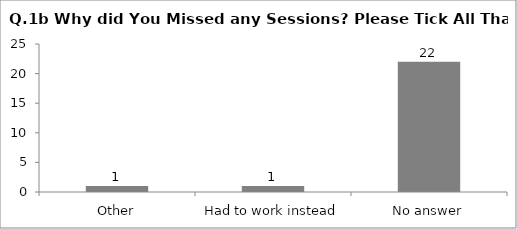
| Category | Q.1b Why did You Missed any Sessions? Please Tick All That Apply |
|---|---|
| Other | 1 |
| Had to work instead | 1 |
| No answer | 22 |